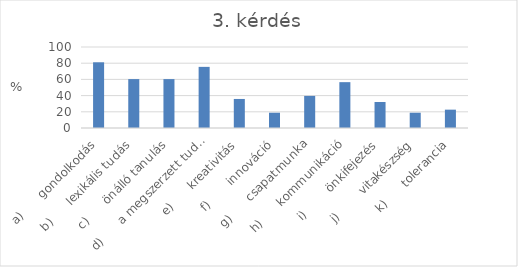
| Category | Series 0 |
|---|---|
| a)      gondolkodás | 81.13 |
| b)      lexikális tudás | 60.38 |
| c)      önálló tanulás | 60.38 |
| d)      a megszerzett tudás alkalmazása | 75.47 |
| e)      kreativitás | 35.85 |
| f)       innováció | 18.87 |
| g)      csapatmunka | 39.62 |
| h)      kommunikáció | 56.6 |
| i)        önkifejezés | 32.08 |
| j)        vitakészség | 18.87 |
| k)      tolerancia | 22.64 |